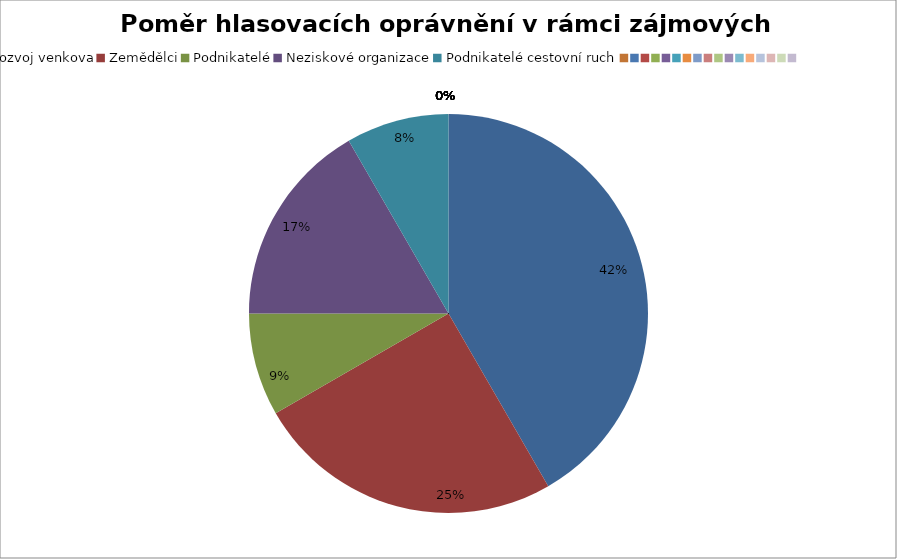
| Category | Series 0 |
|---|---|
| Rozvoj venkova | 0.417 |
| Zemědělci | 0.25 |
| Podnikatelé | 0.083 |
| Neziskové organizace | 0.167 |
| Podnikatelé cestovní ruch | 0.083 |